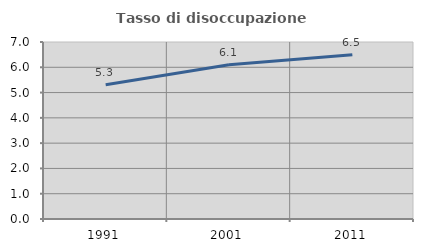
| Category | Tasso di disoccupazione giovanile  |
|---|---|
| 1991.0 | 5.31 |
| 2001.0 | 6.098 |
| 2011.0 | 6.494 |